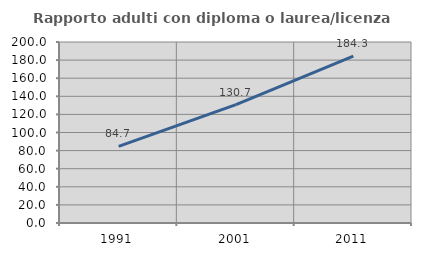
| Category | Rapporto adulti con diploma o laurea/licenza media  |
|---|---|
| 1991.0 | 84.697 |
| 2001.0 | 130.735 |
| 2011.0 | 184.334 |